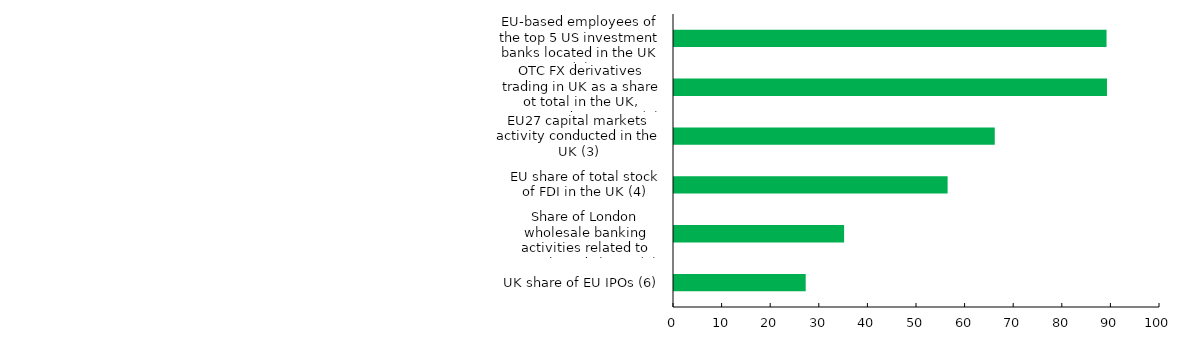
| Category | Series 0 |
|---|---|
| UK share of EU IPOs (6) | 27.1 |
| Share of London wholesale banking activities related to EU27-based clients (5) | 35 |
| EU share of total stock of FDI in the UK (4) | 56.3 |
| EU27 capital markets activity conducted in the UK (3) | 66 |
| OTC FX derivatives trading in UK as a share ot total in the UK, France, and Germany (2) | 89.093 |
| EU-based employees of the top 5 US investment banks located in the UK (1) | 89 |